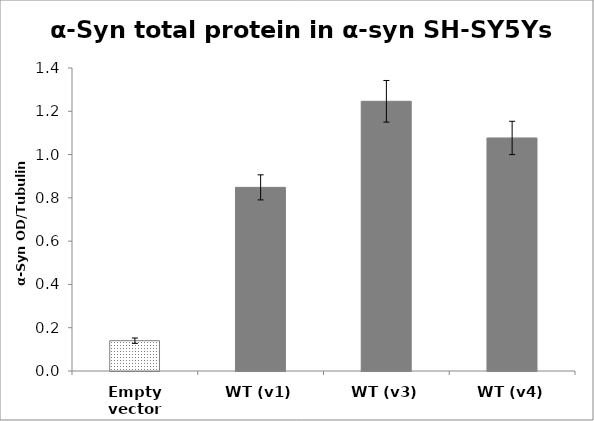
| Category | Series 0 |
|---|---|
| Empty vector | 0.14 |
| WT (v1) | 0.848 |
| WT (v3) | 1.246 |
| WT (v4) | 1.077 |